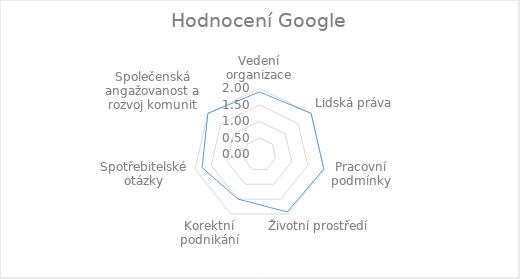
| Category | Series 0 |
|---|---|
| Vedení organizace | 1.897 |
| Lidská práva | 2 |
| Pracovní podmínky | 2 |
| Životní prostředí | 1.933 |
| Korektní podnikání | 1.5 |
| Spotřebitelské otázky | 1.786 |
| Společenská angažovanost a rozvoj komunit | 2 |